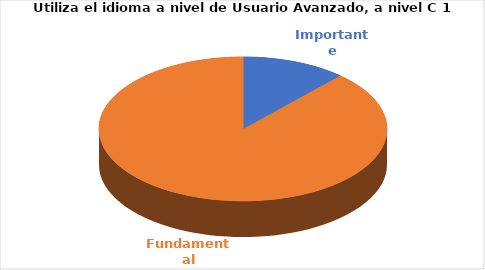
| Category | Series 0 |
|---|---|
| Importante | 2 |
| Fundamental | 15 |